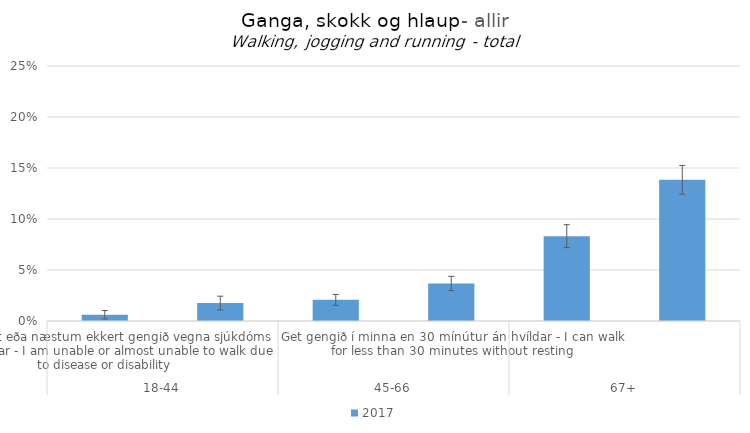
| Category | 2017 |
|---|---|
| 0 | 0.006 |
| 1 | 0.018 |
| 2 | 0.021 |
| 3 | 0.037 |
| 4 | 0.083 |
| 5 | 0.138 |